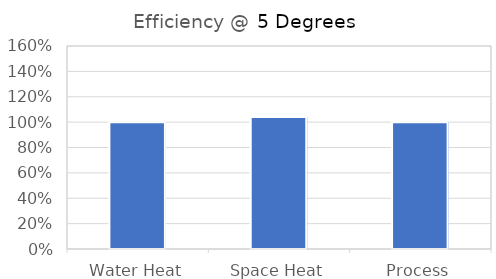
| Category | Series 0 |
|---|---|
| Water Heat | 1 |
| Space Heat | 1.04 |
| Process | 1 |